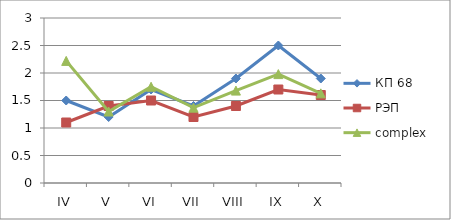
| Category | КП 68 | РЭП  | complex |
|---|---|---|---|
| IV | 1.5 | 1.1 | 2.22 |
| V | 1.2 | 1.4 | 1.3 |
| VI | 1.7 | 1.5 | 1.75 |
| VII | 1.4 | 1.2 | 1.37 |
| VIII | 1.9 | 1.4 | 1.68 |
| IX | 2.5 | 1.7 | 1.98 |
| X | 1.9 | 1.6 | 1.63 |